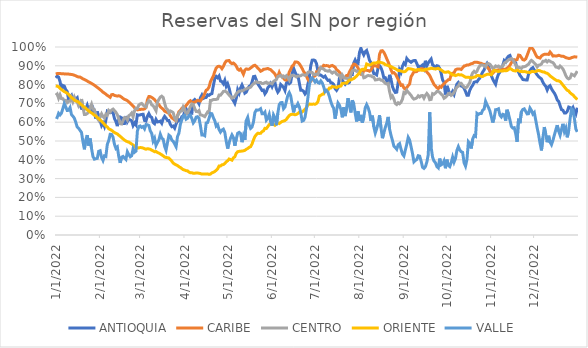
| Category | ANTIOQUIA | CARIBE | CENTRO | ORIENTE | VALLE |
|---|---|---|---|---|---|
| 1/1/22 | 0.836 | 0.856 | 0.744 | 0.793 | 0.628 |
| 1/2/22 | 0.845 | 0.859 | 0.75 | 0.792 | 0.625 |
| 1/3/22 | 0.84 | 0.859 | 0.728 | 0.788 | 0.647 |
| 1/4/22 | 0.817 | 0.859 | 0.746 | 0.78 | 0.639 |
| 1/5/22 | 0.773 | 0.858 | 0.725 | 0.774 | 0.648 |
| 1/6/22 | 0.795 | 0.858 | 0.725 | 0.768 | 0.673 |
| 1/7/22 | 0.792 | 0.857 | 0.714 | 0.762 | 0.699 |
| 1/8/22 | 0.773 | 0.857 | 0.716 | 0.759 | 0.681 |
| 1/9/22 | 0.763 | 0.857 | 0.704 | 0.754 | 0.662 |
| 1/10/22 | 0.72 | 0.856 | 0.712 | 0.748 | 0.663 |
| 1/11/22 | 0.735 | 0.855 | 0.711 | 0.738 | 0.678 |
| 1/12/22 | 0.743 | 0.854 | 0.731 | 0.731 | 0.641 |
| 1/13/22 | 0.714 | 0.852 | 0.71 | 0.725 | 0.632 |
| 1/14/22 | 0.73 | 0.85 | 0.732 | 0.717 | 0.621 |
| 1/15/22 | 0.723 | 0.847 | 0.713 | 0.713 | 0.6 |
| 1/16/22 | 0.73 | 0.843 | 0.709 | 0.711 | 0.574 |
| 1/17/22 | 0.692 | 0.84 | 0.688 | 0.706 | 0.568 |
| 1/18/22 | 0.69 | 0.84 | 0.701 | 0.699 | 0.556 |
| 1/19/22 | 0.673 | 0.836 | 0.723 | 0.692 | 0.545 |
| 1/20/22 | 0.673 | 0.83 | 0.678 | 0.686 | 0.497 |
| 1/21/22 | 0.673 | 0.827 | 0.641 | 0.68 | 0.456 |
| 1/22/22 | 0.671 | 0.823 | 0.641 | 0.675 | 0.506 |
| 1/23/22 | 0.69 | 0.819 | 0.646 | 0.666 | 0.531 |
| 1/24/22 | 0.664 | 0.814 | 0.657 | 0.661 | 0.476 |
| 1/25/22 | 0.678 | 0.811 | 0.677 | 0.654 | 0.513 |
| 1/26/22 | 0.662 | 0.806 | 0.696 | 0.649 | 0.46 |
| 1/27/22 | 0.676 | 0.802 | 0.668 | 0.644 | 0.417 |
| 1/28/22 | 0.655 | 0.797 | 0.667 | 0.637 | 0.403 |
| 1/29/22 | 0.619 | 0.791 | 0.64 | 0.632 | 0.406 |
| 1/30/22 | 0.657 | 0.785 | 0.621 | 0.625 | 0.407 |
| 1/31/22 | 0.625 | 0.779 | 0.61 | 0.619 | 0.445 |
| 2/1/22 | 0.607 | 0.774 | 0.627 | 0.612 | 0.448 |
| 2/2/22 | 0.582 | 0.767 | 0.645 | 0.605 | 0.413 |
| 2/3/22 | 0.596 | 0.76 | 0.63 | 0.597 | 0.396 |
| 2/4/22 | 0.577 | 0.755 | 0.622 | 0.589 | 0.421 |
| 2/5/22 | 0.61 | 0.749 | 0.643 | 0.58 | 0.418 |
| 2/6/22 | 0.658 | 0.743 | 0.637 | 0.574 | 0.482 |
| 2/7/22 | 0.652 | 0.738 | 0.663 | 0.565 | 0.502 |
| 2/8/22 | 0.65 | 0.732 | 0.655 | 0.561 | 0.536 |
| 2/9/22 | 0.654 | 0.746 | 0.664 | 0.557 | 0.535 |
| 2/10/22 | 0.651 | 0.747 | 0.67 | 0.55 | 0.521 |
| 2/11/22 | 0.62 | 0.742 | 0.662 | 0.545 | 0.483 |
| 2/12/22 | 0.604 | 0.741 | 0.653 | 0.541 | 0.461 |
| 2/13/22 | 0.579 | 0.739 | 0.64 | 0.538 | 0.468 |
| 2/14/22 | 0.613 | 0.741 | 0.618 | 0.531 | 0.417 |
| 2/15/22 | 0.627 | 0.738 | 0.592 | 0.525 | 0.384 |
| 2/16/22 | 0.623 | 0.733 | 0.59 | 0.518 | 0.414 |
| 2/17/22 | 0.594 | 0.727 | 0.609 | 0.511 | 0.418 |
| 2/18/22 | 0.594 | 0.721 | 0.625 | 0.505 | 0.41 |
| 2/19/22 | 0.633 | 0.719 | 0.624 | 0.5 | 0.402 |
| 2/20/22 | 0.602 | 0.714 | 0.612 | 0.496 | 0.443 |
| 2/21/22 | 0.616 | 0.708 | 0.634 | 0.494 | 0.428 |
| 2/22/22 | 0.612 | 0.701 | 0.64 | 0.489 | 0.416 |
| 2/23/22 | 0.608 | 0.694 | 0.649 | 0.484 | 0.422 |
| 2/24/22 | 0.582 | 0.685 | 0.628 | 0.479 | 0.458 |
| 2/25/22 | 0.596 | 0.677 | 0.66 | 0.472 | 0.44 |
| 2/26/22 | 0.586 | 0.671 | 0.674 | 0.467 | 0.446 |
| 2/27/22 | 0.639 | 0.665 | 0.673 | 0.462 | 0.553 |
| 2/28/22 | 0.637 | 0.667 | 0.691 | 0.464 | 0.577 |
| 3/1/22 | 0.639 | 0.667 | 0.697 | 0.465 | 0.58 |
| 3/2/22 | 0.641 | 0.669 | 0.7 | 0.465 | 0.573 |
| 3/3/22 | 0.642 | 0.668 | 0.691 | 0.462 | 0.577 |
| 3/4/22 | 0.609 | 0.671 | 0.685 | 0.459 | 0.565 |
| 3/5/22 | 0.606 | 0.678 | 0.681 | 0.456 | 0.587 |
| 3/6/22 | 0.632 | 0.719 | 0.702 | 0.459 | 0.586 |
| 3/7/22 | 0.646 | 0.736 | 0.715 | 0.458 | 0.582 |
| 3/8/22 | 0.63 | 0.736 | 0.71 | 0.456 | 0.554 |
| 3/9/22 | 0.625 | 0.732 | 0.692 | 0.451 | 0.54 |
| 3/10/22 | 0.599 | 0.727 | 0.688 | 0.448 | 0.499 |
| 3/11/22 | 0.592 | 0.72 | 0.675 | 0.443 | 0.515 |
| 3/12/22 | 0.615 | 0.711 | 0.661 | 0.444 | 0.476 |
| 3/13/22 | 0.601 | 0.702 | 0.707 | 0.439 | 0.492 |
| 3/14/22 | 0.602 | 0.693 | 0.721 | 0.436 | 0.506 |
| 3/15/22 | 0.606 | 0.682 | 0.733 | 0.431 | 0.536 |
| 3/16/22 | 0.594 | 0.675 | 0.739 | 0.426 | 0.515 |
| 3/17/22 | 0.618 | 0.669 | 0.731 | 0.421 | 0.509 |
| 3/18/22 | 0.631 | 0.659 | 0.701 | 0.415 | 0.472 |
| 3/19/22 | 0.622 | 0.655 | 0.675 | 0.412 | 0.451 |
| 3/20/22 | 0.609 | 0.651 | 0.668 | 0.411 | 0.491 |
| 3/21/22 | 0.609 | 0.647 | 0.65 | 0.409 | 0.531 |
| 3/22/22 | 0.588 | 0.635 | 0.66 | 0.402 | 0.525 |
| 3/23/22 | 0.576 | 0.623 | 0.656 | 0.393 | 0.505 |
| 3/24/22 | 0.58 | 0.619 | 0.651 | 0.383 | 0.498 |
| 3/25/22 | 0.568 | 0.612 | 0.622 | 0.377 | 0.484 |
| 3/26/22 | 0.591 | 0.607 | 0.61 | 0.373 | 0.47 |
| 3/27/22 | 0.604 | 0.635 | 0.633 | 0.37 | 0.524 |
| 3/28/22 | 0.613 | 0.656 | 0.648 | 0.363 | 0.542 |
| 3/29/22 | 0.607 | 0.662 | 0.658 | 0.359 | 0.589 |
| 3/30/22 | 0.629 | 0.673 | 0.659 | 0.353 | 0.613 |
| 3/31/22 | 0.634 | 0.679 | 0.682 | 0.348 | 0.634 |
| 4/1/22 | 0.653 | 0.681 | 0.668 | 0.345 | 0.636 |
| 4/2/22 | 0.671 | 0.689 | 0.643 | 0.342 | 0.616 |
| 4/3/22 | 0.656 | 0.698 | 0.646 | 0.341 | 0.621 |
| 4/4/22 | 0.661 | 0.709 | 0.665 | 0.335 | 0.636 |
| 4/5/22 | 0.649 | 0.714 | 0.684 | 0.331 | 0.638 |
| 4/6/22 | 0.648 | 0.706 | 0.697 | 0.332 | 0.619 |
| 4/7/22 | 0.714 | 0.707 | 0.693 | 0.328 | 0.596 |
| 4/8/22 | 0.721 | 0.707 | 0.673 | 0.328 | 0.607 |
| 4/9/22 | 0.713 | 0.711 | 0.657 | 0.33 | 0.627 |
| 4/10/22 | 0.712 | 0.716 | 0.656 | 0.33 | 0.629 |
| 4/11/22 | 0.698 | 0.714 | 0.662 | 0.328 | 0.621 |
| 4/12/22 | 0.73 | 0.713 | 0.638 | 0.327 | 0.581 |
| 4/13/22 | 0.744 | 0.725 | 0.638 | 0.324 | 0.532 |
| 4/14/22 | 0.726 | 0.735 | 0.634 | 0.324 | 0.533 |
| 4/15/22 | 0.731 | 0.753 | 0.63 | 0.324 | 0.528 |
| 4/16/22 | 0.732 | 0.77 | 0.642 | 0.324 | 0.596 |
| 4/17/22 | 0.746 | 0.774 | 0.655 | 0.325 | 0.598 |
| 4/18/22 | 0.743 | 0.787 | 0.651 | 0.322 | 0.62 |
| 4/19/22 | 0.749 | 0.815 | 0.716 | 0.324 | 0.647 |
| 4/20/22 | 0.752 | 0.83 | 0.716 | 0.331 | 0.645 |
| 4/21/22 | 0.794 | 0.846 | 0.721 | 0.333 | 0.624 |
| 4/22/22 | 0.831 | 0.869 | 0.721 | 0.338 | 0.608 |
| 4/23/22 | 0.843 | 0.889 | 0.721 | 0.344 | 0.579 |
| 4/24/22 | 0.836 | 0.896 | 0.724 | 0.352 | 0.586 |
| 4/25/22 | 0.846 | 0.898 | 0.745 | 0.367 | 0.561 |
| 4/26/22 | 0.819 | 0.895 | 0.744 | 0.367 | 0.547 |
| 4/27/22 | 0.816 | 0.885 | 0.753 | 0.373 | 0.558 |
| 4/28/22 | 0.805 | 0.897 | 0.764 | 0.374 | 0.563 |
| 4/29/22 | 0.823 | 0.914 | 0.765 | 0.381 | 0.546 |
| 4/30/22 | 0.791 | 0.926 | 0.762 | 0.389 | 0.498 |
| 5/1/22 | 0.805 | 0.927 | 0.754 | 0.395 | 0.46 |
| 5/2/22 | 0.781 | 0.928 | 0.745 | 0.404 | 0.492 |
| 5/3/22 | 0.748 | 0.917 | 0.737 | 0.401 | 0.515 |
| 5/4/22 | 0.725 | 0.911 | 0.728 | 0.398 | 0.533 |
| 5/5/22 | 0.715 | 0.915 | 0.732 | 0.411 | 0.518 |
| 5/6/22 | 0.7 | 0.908 | 0.738 | 0.416 | 0.474 |
| 5/7/22 | 0.727 | 0.898 | 0.752 | 0.435 | 0.511 |
| 5/8/22 | 0.772 | 0.882 | 0.759 | 0.443 | 0.541 |
| 5/9/22 | 0.754 | 0.877 | 0.765 | 0.445 | 0.546 |
| 5/10/22 | 0.782 | 0.883 | 0.766 | 0.445 | 0.54 |
| 5/11/22 | 0.798 | 0.87 | 0.767 | 0.447 | 0.494 |
| 5/12/22 | 0.781 | 0.855 | 0.769 | 0.448 | 0.528 |
| 5/13/22 | 0.755 | 0.877 | 0.775 | 0.45 | 0.505 |
| 5/14/22 | 0.76 | 0.883 | 0.777 | 0.456 | 0.608 |
| 5/15/22 | 0.777 | 0.882 | 0.782 | 0.46 | 0.626 |
| 5/16/22 | 0.791 | 0.882 | 0.782 | 0.466 | 0.587 |
| 5/17/22 | 0.794 | 0.888 | 0.786 | 0.47 | 0.567 |
| 5/18/22 | 0.813 | 0.894 | 0.796 | 0.484 | 0.574 |
| 5/19/22 | 0.842 | 0.901 | 0.804 | 0.505 | 0.601 |
| 5/20/22 | 0.844 | 0.903 | 0.809 | 0.524 | 0.651 |
| 5/21/22 | 0.824 | 0.897 | 0.816 | 0.534 | 0.665 |
| 5/22/22 | 0.805 | 0.888 | 0.811 | 0.541 | 0.664 |
| 5/23/22 | 0.793 | 0.881 | 0.811 | 0.54 | 0.666 |
| 5/24/22 | 0.781 | 0.871 | 0.811 | 0.541 | 0.672 |
| 5/25/22 | 0.769 | 0.874 | 0.806 | 0.549 | 0.645 |
| 5/26/22 | 0.771 | 0.882 | 0.806 | 0.554 | 0.645 |
| 5/27/22 | 0.751 | 0.882 | 0.811 | 0.567 | 0.654 |
| 5/28/22 | 0.762 | 0.884 | 0.813 | 0.566 | 0.611 |
| 5/29/22 | 0.783 | 0.886 | 0.805 | 0.577 | 0.621 |
| 5/30/22 | 0.791 | 0.882 | 0.809 | 0.587 | 0.642 |
| 5/31/22 | 0.805 | 0.88 | 0.808 | 0.59 | 0.601 |
| 6/1/22 | 0.789 | 0.871 | 0.804 | 0.593 | 0.581 |
| 6/2/22 | 0.807 | 0.865 | 0.816 | 0.589 | 0.639 |
| 6/3/22 | 0.811 | 0.857 | 0.822 | 0.583 | 0.624 |
| 6/4/22 | 0.778 | 0.841 | 0.827 | 0.589 | 0.584 |
| 6/5/22 | 0.76 | 0.843 | 0.842 | 0.596 | 0.647 |
| 6/6/22 | 0.77 | 0.864 | 0.846 | 0.593 | 0.694 |
| 6/7/22 | 0.801 | 0.847 | 0.85 | 0.599 | 0.704 |
| 6/8/22 | 0.794 | 0.846 | 0.84 | 0.604 | 0.704 |
| 6/9/22 | 0.785 | 0.833 | 0.845 | 0.606 | 0.672 |
| 6/10/22 | 0.769 | 0.825 | 0.838 | 0.609 | 0.681 |
| 6/11/22 | 0.809 | 0.824 | 0.847 | 0.615 | 0.712 |
| 6/12/22 | 0.818 | 0.839 | 0.839 | 0.626 | 0.743 |
| 6/13/22 | 0.805 | 0.867 | 0.824 | 0.635 | 0.757 |
| 6/14/22 | 0.812 | 0.882 | 0.845 | 0.641 | 0.74 |
| 6/15/22 | 0.858 | 0.898 | 0.85 | 0.642 | 0.694 |
| 6/16/22 | 0.888 | 0.905 | 0.847 | 0.642 | 0.652 |
| 6/17/22 | 0.867 | 0.92 | 0.846 | 0.64 | 0.685 |
| 6/18/22 | 0.849 | 0.921 | 0.841 | 0.641 | 0.683 |
| 6/19/22 | 0.85 | 0.918 | 0.846 | 0.646 | 0.699 |
| 6/20/22 | 0.809 | 0.911 | 0.845 | 0.653 | 0.682 |
| 6/21/22 | 0.77 | 0.899 | 0.847 | 0.653 | 0.651 |
| 6/22/22 | 0.77 | 0.885 | 0.852 | 0.655 | 0.606 |
| 6/23/22 | 0.764 | 0.87 | 0.852 | 0.662 | 0.609 |
| 6/24/22 | 0.75 | 0.859 | 0.849 | 0.668 | 0.626 |
| 6/25/22 | 0.759 | 0.844 | 0.852 | 0.677 | 0.673 |
| 6/26/22 | 0.802 | 0.827 | 0.865 | 0.691 | 0.73 |
| 6/27/22 | 0.84 | 0.816 | 0.868 | 0.697 | 0.797 |
| 6/28/22 | 0.901 | 0.817 | 0.865 | 0.696 | 0.829 |
| 6/29/22 | 0.93 | 0.829 | 0.864 | 0.696 | 0.836 |
| 6/30/22 | 0.931 | 0.846 | 0.853 | 0.696 | 0.826 |
| 7/1/22 | 0.928 | 0.846 | 0.854 | 0.695 | 0.814 |
| 7/2/22 | 0.911 | 0.867 | 0.856 | 0.7 | 0.823 |
| 7/3/22 | 0.87 | 0.864 | 0.853 | 0.709 | 0.811 |
| 7/4/22 | 0.851 | 0.884 | 0.876 | 0.74 | 0.807 |
| 7/5/22 | 0.85 | 0.892 | 0.89 | 0.743 | 0.82 |
| 7/6/22 | 0.845 | 0.892 | 0.885 | 0.748 | 0.809 |
| 7/7/22 | 0.839 | 0.903 | 0.883 | 0.75 | 0.789 |
| 7/8/22 | 0.845 | 0.9 | 0.875 | 0.77 | 0.763 |
| 7/9/22 | 0.832 | 0.901 | 0.874 | 0.77 | 0.769 |
| 7/10/22 | 0.822 | 0.9 | 0.871 | 0.77 | 0.759 |
| 7/11/22 | 0.824 | 0.895 | 0.875 | 0.782 | 0.736 |
| 7/12/22 | 0.81 | 0.9 | 0.868 | 0.782 | 0.709 |
| 7/13/22 | 0.809 | 0.902 | 0.861 | 0.789 | 0.688 |
| 7/14/22 | 0.801 | 0.897 | 0.867 | 0.788 | 0.674 |
| 7/15/22 | 0.778 | 0.892 | 0.867 | 0.788 | 0.619 |
| 7/16/22 | 0.769 | 0.879 | 0.856 | 0.783 | 0.662 |
| 7/17/22 | 0.783 | 0.874 | 0.851 | 0.789 | 0.702 |
| 7/18/22 | 0.835 | 0.866 | 0.851 | 0.791 | 0.691 |
| 7/19/22 | 0.847 | 0.852 | 0.83 | 0.792 | 0.668 |
| 7/20/22 | 0.823 | 0.842 | 0.851 | 0.806 | 0.626 |
| 7/21/22 | 0.811 | 0.837 | 0.84 | 0.807 | 0.679 |
| 7/22/22 | 0.802 | 0.838 | 0.834 | 0.808 | 0.632 |
| 7/23/22 | 0.811 | 0.848 | 0.834 | 0.807 | 0.675 |
| 7/24/22 | 0.808 | 0.849 | 0.829 | 0.817 | 0.728 |
| 7/25/22 | 0.812 | 0.867 | 0.832 | 0.824 | 0.685 |
| 7/26/22 | 0.857 | 0.881 | 0.854 | 0.825 | 0.652 |
| 7/27/22 | 0.854 | 0.899 | 0.873 | 0.829 | 0.716 |
| 7/28/22 | 0.915 | 0.909 | 0.876 | 0.832 | 0.697 |
| 7/29/22 | 0.931 | 0.907 | 0.877 | 0.839 | 0.648 |
| 7/30/22 | 0.915 | 0.9 | 0.87 | 0.845 | 0.604 |
| 7/31/22 | 0.912 | 0.889 | 0.871 | 0.855 | 0.658 |
| 8/1/22 | 0.971 | 0.871 | 0.861 | 0.862 | 0.607 |
| 8/2/22 | 0.994 | 0.855 | 0.862 | 0.878 | 0.639 |
| 8/3/22 | 0.973 | 0.854 | 0.859 | 0.881 | 0.598 |
| 8/4/22 | 0.958 | 0.875 | 0.836 | 0.881 | 0.627 |
| 8/5/22 | 0.975 | 0.877 | 0.839 | 0.884 | 0.676 |
| 8/6/22 | 0.982 | 0.876 | 0.845 | 0.91 | 0.694 |
| 8/7/22 | 0.958 | 0.875 | 0.849 | 0.906 | 0.678 |
| 8/8/22 | 0.929 | 0.871 | 0.847 | 0.903 | 0.653 |
| 8/9/22 | 0.916 | 0.877 | 0.847 | 0.906 | 0.606 |
| 8/10/22 | 0.883 | 0.891 | 0.841 | 0.913 | 0.635 |
| 8/11/22 | 0.858 | 0.902 | 0.84 | 0.915 | 0.575 |
| 8/12/22 | 0.857 | 0.901 | 0.825 | 0.914 | 0.542 |
| 8/13/22 | 0.851 | 0.898 | 0.826 | 0.916 | 0.565 |
| 8/14/22 | 0.891 | 0.895 | 0.828 | 0.921 | 0.594 |
| 8/15/22 | 0.9 | 0.962 | 0.83 | 0.919 | 0.637 |
| 8/16/22 | 0.89 | 0.979 | 0.824 | 0.918 | 0.571 |
| 8/17/22 | 0.868 | 0.98 | 0.823 | 0.915 | 0.515 |
| 8/18/22 | 0.835 | 0.972 | 0.814 | 0.912 | 0.542 |
| 8/19/22 | 0.837 | 0.956 | 0.807 | 0.906 | 0.572 |
| 8/20/22 | 0.819 | 0.938 | 0.803 | 0.904 | 0.594 |
| 8/21/22 | 0.804 | 0.921 | 0.806 | 0.902 | 0.628 |
| 8/22/22 | 0.852 | 0.901 | 0.763 | 0.898 | 0.564 |
| 8/23/22 | 0.828 | 0.878 | 0.731 | 0.896 | 0.53 |
| 8/24/22 | 0.79 | 0.862 | 0.74 | 0.892 | 0.504 |
| 8/25/22 | 0.77 | 0.864 | 0.723 | 0.888 | 0.473 |
| 8/26/22 | 0.758 | 0.857 | 0.7 | 0.884 | 0.465 |
| 8/27/22 | 0.76 | 0.843 | 0.694 | 0.88 | 0.456 |
| 8/28/22 | 0.812 | 0.827 | 0.703 | 0.875 | 0.479 |
| 8/29/22 | 0.879 | 0.812 | 0.698 | 0.875 | 0.486 |
| 8/30/22 | 0.865 | 0.796 | 0.706 | 0.872 | 0.457 |
| 8/31/22 | 0.898 | 0.798 | 0.723 | 0.87 | 0.43 |
| 9/1/22 | 0.915 | 0.782 | 0.758 | 0.868 | 0.42 |
| 9/2/22 | 0.907 | 0.775 | 0.753 | 0.87 | 0.452 |
| 9/3/22 | 0.939 | 0.784 | 0.769 | 0.878 | 0.483 |
| 9/4/22 | 0.929 | 0.795 | 0.759 | 0.885 | 0.519 |
| 9/5/22 | 0.924 | 0.803 | 0.752 | 0.884 | 0.505 |
| 9/6/22 | 0.919 | 0.842 | 0.743 | 0.883 | 0.469 |
| 9/7/22 | 0.925 | 0.854 | 0.73 | 0.881 | 0.434 |
| 9/8/22 | 0.928 | 0.869 | 0.723 | 0.879 | 0.389 |
| 9/9/22 | 0.928 | 0.868 | 0.726 | 0.876 | 0.397 |
| 9/10/22 | 0.912 | 0.869 | 0.73 | 0.878 | 0.402 |
| 9/11/22 | 0.894 | 0.877 | 0.74 | 0.881 | 0.422 |
| 9/12/22 | 0.897 | 0.878 | 0.734 | 0.878 | 0.419 |
| 9/13/22 | 0.897 | 0.885 | 0.741 | 0.877 | 0.393 |
| 9/14/22 | 0.904 | 0.885 | 0.742 | 0.876 | 0.36 |
| 9/15/22 | 0.887 | 0.881 | 0.727 | 0.876 | 0.354 |
| 9/16/22 | 0.927 | 0.876 | 0.742 | 0.882 | 0.363 |
| 9/17/22 | 0.9 | 0.867 | 0.753 | 0.882 | 0.388 |
| 9/18/22 | 0.916 | 0.859 | 0.743 | 0.883 | 0.428 |
| 9/19/22 | 0.927 | 0.849 | 0.719 | 0.884 | 0.653 |
| 9/20/22 | 0.936 | 0.832 | 0.721 | 0.887 | 0.466 |
| 9/21/22 | 0.906 | 0.816 | 0.752 | 0.885 | 0.414 |
| 9/22/22 | 0.899 | 0.801 | 0.749 | 0.885 | 0.394 |
| 9/23/22 | 0.889 | 0.793 | 0.755 | 0.883 | 0.385 |
| 9/24/22 | 0.9 | 0.783 | 0.763 | 0.885 | 0.364 |
| 9/25/22 | 0.898 | 0.779 | 0.763 | 0.887 | 0.357 |
| 9/26/22 | 0.886 | 0.789 | 0.758 | 0.881 | 0.407 |
| 9/27/22 | 0.861 | 0.786 | 0.749 | 0.877 | 0.373 |
| 9/28/22 | 0.825 | 0.797 | 0.743 | 0.872 | 0.378 |
| 9/29/22 | 0.812 | 0.805 | 0.727 | 0.867 | 0.394 |
| 9/30/22 | 0.747 | 0.812 | 0.732 | 0.865 | 0.355 |
| 10/1/22 | 0.793 | 0.819 | 0.74 | 0.867 | 0.401 |
| 10/2/22 | 0.773 | 0.826 | 0.752 | 0.868 | 0.371 |
| 10/3/22 | 0.749 | 0.827 | 0.754 | 0.863 | 0.364 |
| 10/4/22 | 0.751 | 0.853 | 0.743 | 0.857 | 0.385 |
| 10/5/22 | 0.764 | 0.861 | 0.748 | 0.851 | 0.414 |
| 10/6/22 | 0.748 | 0.862 | 0.759 | 0.851 | 0.388 |
| 10/7/22 | 0.777 | 0.879 | 0.773 | 0.848 | 0.407 |
| 10/8/22 | 0.803 | 0.882 | 0.787 | 0.851 | 0.45 |
| 10/9/22 | 0.811 | 0.883 | 0.791 | 0.854 | 0.47 |
| 10/10/22 | 0.799 | 0.883 | 0.807 | 0.851 | 0.452 |
| 10/11/22 | 0.792 | 0.881 | 0.807 | 0.852 | 0.443 |
| 10/12/22 | 0.79 | 0.89 | 0.796 | 0.849 | 0.439 |
| 10/13/22 | 0.781 | 0.899 | 0.788 | 0.844 | 0.384 |
| 10/14/22 | 0.763 | 0.9 | 0.783 | 0.839 | 0.366 |
| 10/15/22 | 0.743 | 0.904 | 0.786 | 0.839 | 0.401 |
| 10/16/22 | 0.743 | 0.904 | 0.799 | 0.84 | 0.496 |
| 10/17/22 | 0.77 | 0.907 | 0.811 | 0.837 | 0.487 |
| 10/18/22 | 0.786 | 0.911 | 0.844 | 0.837 | 0.46 |
| 10/19/22 | 0.797 | 0.913 | 0.863 | 0.836 | 0.51 |
| 10/20/22 | 0.813 | 0.918 | 0.871 | 0.84 | 0.529 |
| 10/21/22 | 0.815 | 0.919 | 0.864 | 0.841 | 0.525 |
| 10/22/22 | 0.814 | 0.919 | 0.871 | 0.848 | 0.647 |
| 10/23/22 | 0.826 | 0.917 | 0.889 | 0.849 | 0.641 |
| 10/24/22 | 0.835 | 0.914 | 0.9 | 0.847 | 0.646 |
| 10/25/22 | 0.853 | 0.913 | 0.904 | 0.843 | 0.646 |
| 10/26/22 | 0.867 | 0.909 | 0.904 | 0.843 | 0.664 |
| 10/27/22 | 0.878 | 0.908 | 0.901 | 0.848 | 0.67 |
| 10/28/22 | 0.9 | 0.903 | 0.894 | 0.851 | 0.711 |
| 10/29/22 | 0.913 | 0.896 | 0.911 | 0.854 | 0.693 |
| 10/30/22 | 0.899 | 0.886 | 0.912 | 0.856 | 0.678 |
| 10/31/22 | 0.872 | 0.874 | 0.909 | 0.854 | 0.66 |
| 11/1/22 | 0.848 | 0.862 | 0.898 | 0.852 | 0.63 |
| 11/2/22 | 0.829 | 0.86 | 0.887 | 0.869 | 0.598 |
| 11/3/22 | 0.815 | 0.869 | 0.889 | 0.876 | 0.625 |
| 11/4/22 | 0.802 | 0.875 | 0.899 | 0.874 | 0.666 |
| 11/5/22 | 0.834 | 0.877 | 0.896 | 0.872 | 0.668 |
| 11/6/22 | 0.855 | 0.879 | 0.899 | 0.869 | 0.671 |
| 11/7/22 | 0.866 | 0.88 | 0.891 | 0.873 | 0.637 |
| 11/8/22 | 0.888 | 0.879 | 0.895 | 0.872 | 0.628 |
| 11/9/22 | 0.903 | 0.88 | 0.898 | 0.872 | 0.642 |
| 11/10/22 | 0.928 | 0.881 | 0.914 | 0.875 | 0.639 |
| 11/11/22 | 0.921 | 0.882 | 0.919 | 0.874 | 0.608 |
| 11/12/22 | 0.942 | 0.887 | 0.924 | 0.875 | 0.666 |
| 11/13/22 | 0.951 | 0.894 | 0.932 | 0.881 | 0.643 |
| 11/14/22 | 0.955 | 0.902 | 0.935 | 0.886 | 0.612 |
| 11/15/22 | 0.934 | 0.916 | 0.939 | 0.882 | 0.577 |
| 11/16/22 | 0.927 | 0.927 | 0.933 | 0.876 | 0.569 |
| 11/17/22 | 0.92 | 0.933 | 0.919 | 0.874 | 0.571 |
| 11/18/22 | 0.916 | 0.931 | 0.905 | 0.872 | 0.54 |
| 11/19/22 | 0.879 | 0.933 | 0.887 | 0.877 | 0.496 |
| 11/20/22 | 0.867 | 0.957 | 0.893 | 0.874 | 0.619 |
| 11/21/22 | 0.849 | 0.955 | 0.89 | 0.87 | 0.595 |
| 11/22/22 | 0.84 | 0.944 | 0.886 | 0.87 | 0.655 |
| 11/23/22 | 0.827 | 0.933 | 0.895 | 0.869 | 0.668 |
| 11/24/22 | 0.826 | 0.93 | 0.895 | 0.869 | 0.671 |
| 11/25/22 | 0.825 | 0.937 | 0.898 | 0.869 | 0.658 |
| 11/26/22 | 0.825 | 0.955 | 0.904 | 0.865 | 0.644 |
| 11/27/22 | 0.856 | 0.976 | 0.909 | 0.866 | 0.645 |
| 11/28/22 | 0.875 | 0.996 | 0.921 | 0.864 | 0.675 |
| 11/29/22 | 0.885 | 0.997 | 0.929 | 0.869 | 0.663 |
| 11/30/22 | 0.89 | 0.989 | 0.923 | 0.87 | 0.643 |
| 12/1/22 | 0.877 | 0.976 | 0.914 | 0.868 | 0.652 |
| 12/2/22 | 0.863 | 0.959 | 0.907 | 0.87 | 0.611 |
| 12/3/22 | 0.852 | 0.946 | 0.894 | 0.874 | 0.57 |
| 12/4/22 | 0.843 | 0.944 | 0.903 | 0.875 | 0.533 |
| 12/5/22 | 0.836 | 0.941 | 0.905 | 0.873 | 0.489 |
| 12/6/22 | 0.83 | 0.952 | 0.91 | 0.87 | 0.45 |
| 12/7/22 | 0.812 | 0.958 | 0.924 | 0.868 | 0.517 |
| 12/8/22 | 0.8 | 0.961 | 0.924 | 0.867 | 0.574 |
| 12/9/22 | 0.791 | 0.962 | 0.929 | 0.862 | 0.536 |
| 12/10/22 | 0.771 | 0.962 | 0.921 | 0.86 | 0.494 |
| 12/11/22 | 0.789 | 0.961 | 0.928 | 0.854 | 0.528 |
| 12/12/22 | 0.794 | 0.973 | 0.924 | 0.846 | 0.494 |
| 12/13/22 | 0.778 | 0.964 | 0.92 | 0.841 | 0.48 |
| 12/14/22 | 0.765 | 0.952 | 0.917 | 0.835 | 0.503 |
| 12/15/22 | 0.755 | 0.953 | 0.908 | 0.829 | 0.532 |
| 12/16/22 | 0.74 | 0.952 | 0.894 | 0.825 | 0.559 |
| 12/17/22 | 0.719 | 0.953 | 0.892 | 0.82 | 0.584 |
| 12/18/22 | 0.711 | 0.956 | 0.888 | 0.82 | 0.552 |
| 12/19/22 | 0.688 | 0.954 | 0.899 | 0.816 | 0.531 |
| 12/20/22 | 0.667 | 0.951 | 0.892 | 0.808 | 0.562 |
| 12/21/22 | 0.663 | 0.951 | 0.883 | 0.797 | 0.591 |
| 12/22/22 | 0.649 | 0.948 | 0.867 | 0.788 | 0.55 |
| 12/23/22 | 0.649 | 0.943 | 0.848 | 0.778 | 0.569 |
| 12/24/22 | 0.658 | 0.941 | 0.835 | 0.77 | 0.52 |
| 12/25/22 | 0.681 | 0.939 | 0.83 | 0.767 | 0.556 |
| 12/26/22 | 0.678 | 0.94 | 0.835 | 0.756 | 0.619 |
| 12/27/22 | 0.667 | 0.943 | 0.855 | 0.75 | 0.671 |
| 12/28/22 | 0.679 | 0.946 | 0.851 | 0.745 | 0.665 |
| 12/29/22 | 0.657 | 0.948 | 0.847 | 0.736 | 0.619 |
| 12/30/22 | 0.643 | 0.947 | 0.859 | 0.729 | 0.564 |
| 12/31/22 | 0.677 | 0.946 | 0.872 | 0.72 | 0.549 |